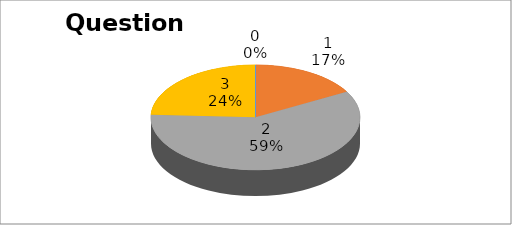
| Category | Series 0 |
|---|---|
| 0 | 0 |
| 1 | 16 |
| 2 | 56 |
| 3 | 23 |